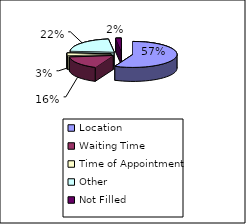
| Category | Why did you choose Oakwood for your surgery |
|---|---|
| Location | 55 |
| Waiting Time | 16 |
| Time of Appointment | 3 |
| Other | 21 |
| Not Filled | 2 |